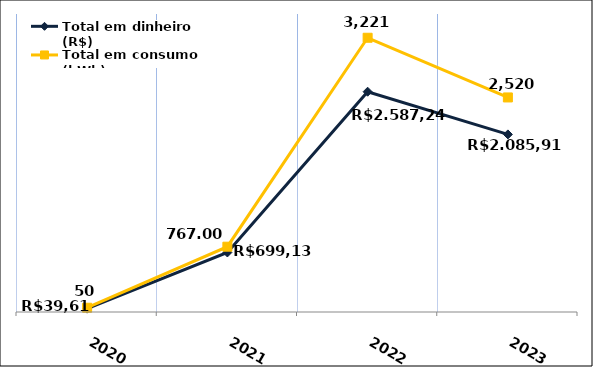
| Category | Total em dinheiro (R$) |
|---|---|
| 2020.0 | 39.61 |
| 2021.0 | 699.13 |
| 2022.0 | 2587.24 |
| 2023.0 | 2085.91 |